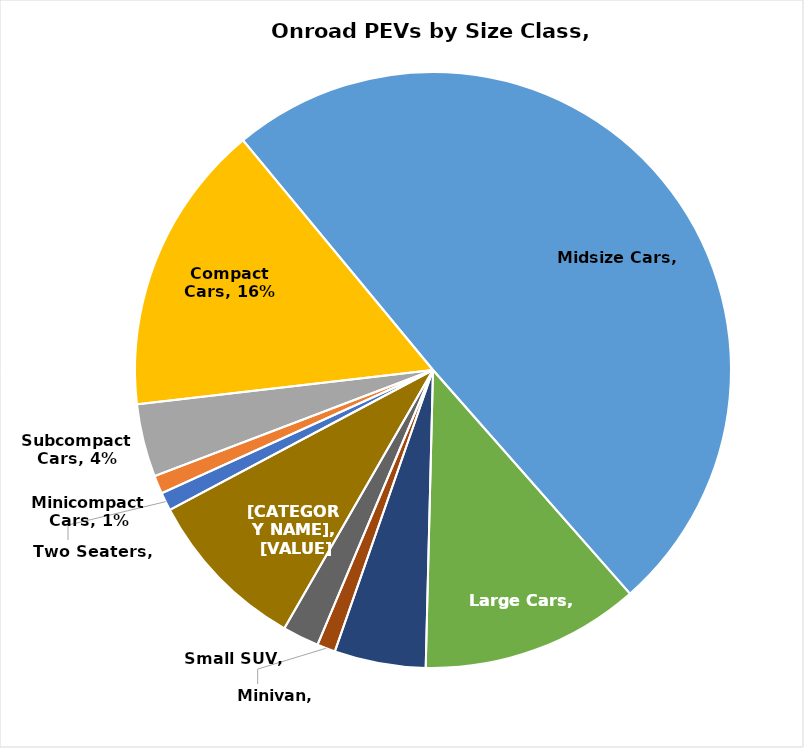
| Category | Series 0 |
|---|---|
| Two Seaters | 0.01 |
| Minicompact
Cars | 0.01 |
| Subcompact Cars | 0.04 |
| Compact Cars | 0.16 |
| Midsize Cars | 0.5 |
| Large Cars | 0.12 |
| Small Station Wagons | 0.05 |
| Minivan | 0.01 |
| Small SUV | 0.02 |
| Standard SUV | 0.09 |